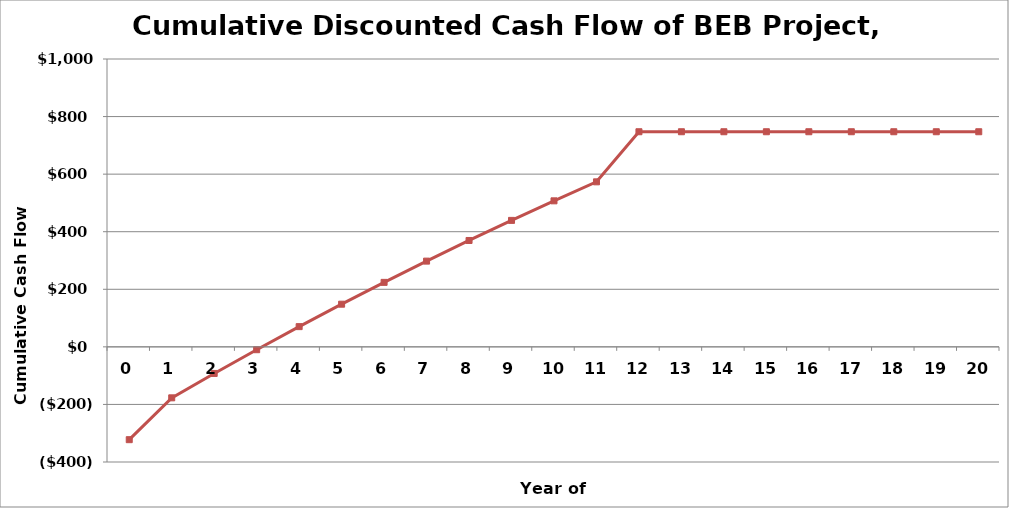
| Category | Series 1 |
|---|---|
| 0.0 | -322467.181 |
| 1.0 | -177079.093 |
| 2.0 | -92348.225 |
| 3.0 | -9930.684 |
| 4.0 | 70236.025 |
| 5.0 | 148212.734 |
| 6.0 | 224058.654 |
| 7.0 | 297831.422 |
| 8.0 | 369587.136 |
| 9.0 | 439380.399 |
| 10.0 | 507264.357 |
| 11.0 | 573290.737 |
| 12.0 | 747290.388 |
| 13.0 | 747290.388 |
| 14.0 | 747290.388 |
| 15.0 | 747290.388 |
| 16.0 | 747290.388 |
| 17.0 | 747290.388 |
| 18.0 | 747290.388 |
| 19.0 | 747290.388 |
| 20.0 | 747290.388 |